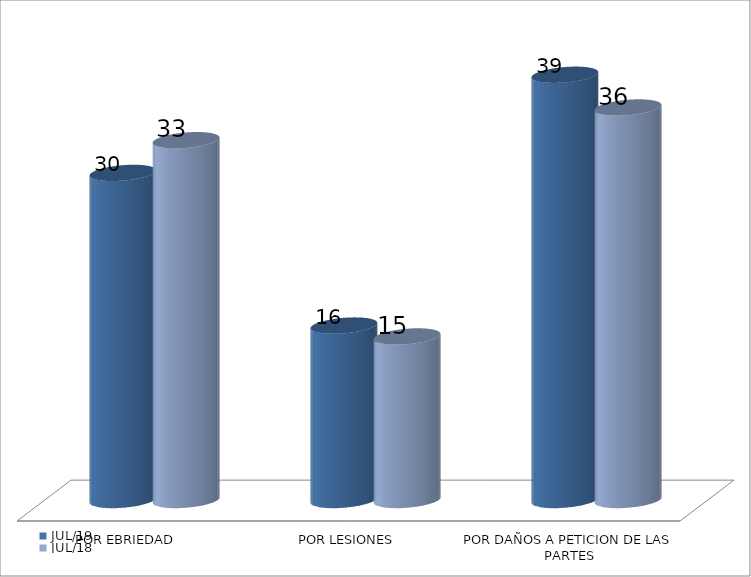
| Category | JUL/19 | JUL/18 |
|---|---|---|
| POR EBRIEDAD | 30 | 33 |
| POR LESIONES | 16 | 15 |
| POR DAÑOS A PETICION DE LAS PARTES | 39 | 36 |